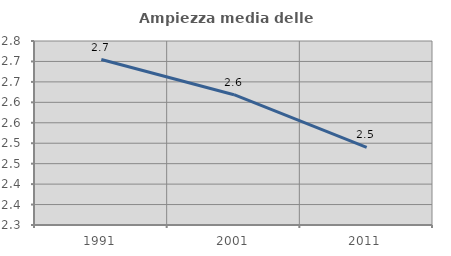
| Category | Ampiezza media delle famiglie |
|---|---|
| 1991.0 | 2.705 |
| 2001.0 | 2.619 |
| 2011.0 | 2.49 |